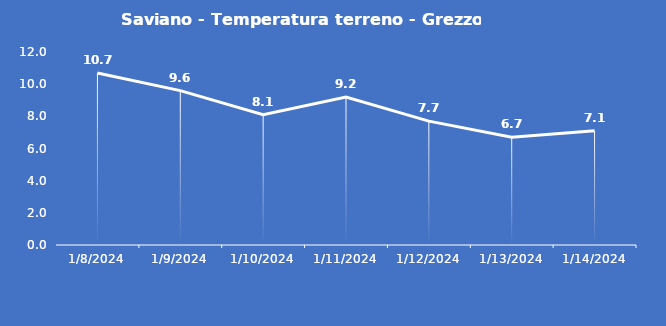
| Category | Saviano - Temperatura terreno - Grezzo (°C) |
|---|---|
| 1/8/24 | 10.7 |
| 1/9/24 | 9.6 |
| 1/10/24 | 8.1 |
| 1/11/24 | 9.2 |
| 1/12/24 | 7.7 |
| 1/13/24 | 6.7 |
| 1/14/24 | 7.1 |